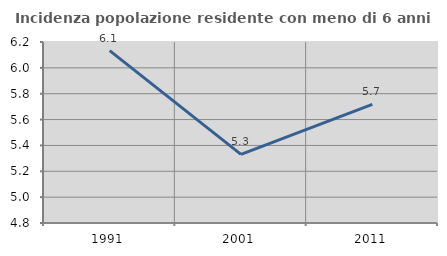
| Category | Incidenza popolazione residente con meno di 6 anni |
|---|---|
| 1991.0 | 6.133 |
| 2001.0 | 5.331 |
| 2011.0 | 5.718 |